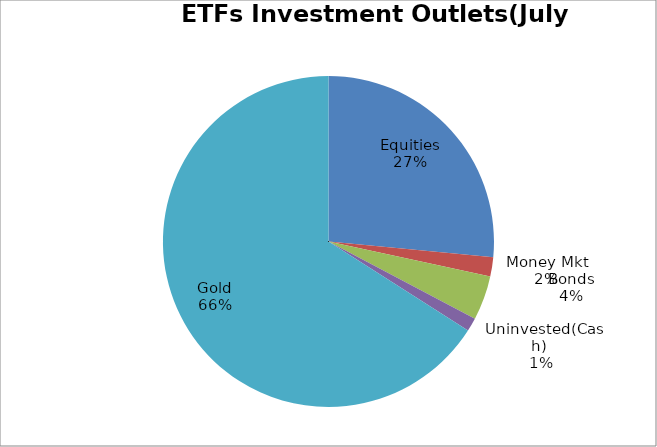
| Category | Series 0 |
|---|---|
| Equities | 3831828644.68 |
| Money Mkt | 272103487.34 |
| Bonds | 625862830.11 |
| Uninvested(Cash) | 191169576.23 |
| Gold | 9533055643.75 |